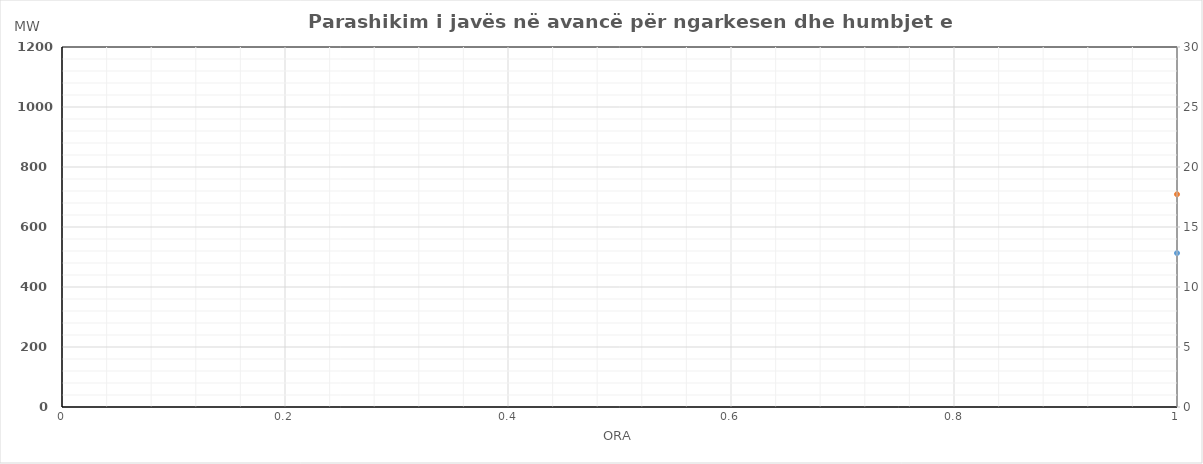
| Category | Ngarkesa (MWh) |
|---|---|
| 0 | 709.122 |
| 1 | 662.006 |
| 2 | 616.678 |
| 3 | 594.066 |
| 4 | 608.795 |
| 5 | 653.166 |
| 6 | 726.754 |
| 7 | 868.369 |
| 8 | 961.529 |
| 9 | 1009.615 |
| 10 | 1032.74 |
| 11 | 1063.938 |
| 12 | 1072.071 |
| 13 | 1075.206 |
| 14 | 1069.549 |
| 15 | 1013.092 |
| 16 | 1015.357 |
| 17 | 1006.442 |
| 18 | 1038.839 |
| 19 | 1032.155 |
| 20 | 1058.462 |
| 21 | 1021.475 |
| 22 | 902.506 |
| 23 | 811.954 |
| 24 | 712.151 |
| 25 | 638.193 |
| 26 | 618.917 |
| 27 | 592.677 |
| 28 | 603.714 |
| 29 | 648.799 |
| 30 | 741.279 |
| 31 | 866.978 |
| 32 | 953.699 |
| 33 | 1001.772 |
| 34 | 1027.062 |
| 35 | 1057.675 |
| 36 | 1056.378 |
| 37 | 1071.721 |
| 38 | 1059.329 |
| 39 | 1037.241 |
| 40 | 1019.075 |
| 41 | 1023.681 |
| 42 | 1040.565 |
| 43 | 1041.687 |
| 44 | 1074.293 |
| 45 | 1028.161 |
| 46 | 926.267 |
| 47 | 807.126 |
| 48 | 677.967 |
| 49 | 627.084 |
| 50 | 593.076 |
| 51 | 585.456 |
| 52 | 584.408 |
| 53 | 612.422 |
| 54 | 706.678 |
| 55 | 842.505 |
| 56 | 954.4 |
| 57 | 1004.951 |
| 58 | 1033.629 |
| 59 | 1055.998 |
| 60 | 1067.582 |
| 61 | 1056.495 |
| 62 | 1061.86 |
| 63 | 1032.567 |
| 64 | 1025.5 |
| 65 | 1032.021 |
| 66 | 1050.175 |
| 67 | 1052.068 |
| 68 | 1085.963 |
| 69 | 1040.629 |
| 70 | 947.583 |
| 71 | 829.214 |
| 72 | 722.891 |
| 73 | 657.787 |
| 74 | 607.181 |
| 75 | 592.689 |
| 76 | 605.164 |
| 77 | 604.873 |
| 78 | 698.883 |
| 79 | 853.633 |
| 80 | 959.229 |
| 81 | 1009.278 |
| 82 | 1046.77 |
| 83 | 1068.838 |
| 84 | 1074.916 |
| 85 | 1088.371 |
| 86 | 1074.172 |
| 87 | 1046.831 |
| 88 | 1039.358 |
| 89 | 1051.514 |
| 90 | 1067.143 |
| 91 | 1069.365 |
| 92 | 1099.661 |
| 93 | 1052.409 |
| 94 | 930.284 |
| 95 | 811.899 |
| 96 | 709.517 |
| 97 | 645.724 |
| 98 | 604.314 |
| 99 | 587.427 |
| 100 | 593.102 |
| 101 | 639.715 |
| 102 | 730.884 |
| 103 | 849.001 |
| 104 | 961.782 |
| 105 | 993.825 |
| 106 | 1023.754 |
| 107 | 1070.109 |
| 108 | 1091.244 |
| 109 | 1091.245 |
| 110 | 1072.498 |
| 111 | 1041.953 |
| 112 | 1038.373 |
| 113 | 1068.586 |
| 114 | 1075.979 |
| 115 | 1078.608 |
| 116 | 1109.573 |
| 117 | 1042.268 |
| 118 | 942.166 |
| 119 | 830.546 |
| 120 | 729.164 |
| 121 | 649.808 |
| 122 | 604.698 |
| 123 | 574.841 |
| 124 | 570.799 |
| 125 | 596.498 |
| 126 | 696.191 |
| 127 | 835.102 |
| 128 | 933.694 |
| 129 | 989.903 |
| 130 | 1026.804 |
| 131 | 1053.868 |
| 132 | 1071.395 |
| 133 | 1082.968 |
| 134 | 1065.141 |
| 135 | 1037.779 |
| 136 | 1034.568 |
| 137 | 1039.891 |
| 138 | 1067.636 |
| 139 | 1075.417 |
| 140 | 1115.216 |
| 141 | 1065.949 |
| 142 | 956.012 |
| 143 | 845.934 |
| 144 | 751.158 |
| 145 | 678.62 |
| 146 | 637.974 |
| 147 | 636.987 |
| 148 | 632.348 |
| 149 | 644.864 |
| 150 | 689.041 |
| 151 | 815.291 |
| 152 | 882.186 |
| 153 | 918.613 |
| 154 | 950.169 |
| 155 | 981.865 |
| 156 | 1009.855 |
| 157 | 1015.613 |
| 158 | 988.806 |
| 159 | 974.722 |
| 160 | 981.451 |
| 161 | 1005.28 |
| 162 | 1034.205 |
| 163 | 1051.131 |
| 164 | 1102.373 |
| 165 | 1047.725 |
| 166 | 963.71 |
| 167 | 839.512 |